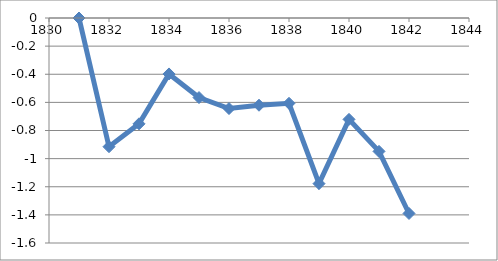
| Category | Series 0 |
|---|---|
| 1831.0 | 0 |
| 1832.0 | -0.915 |
| 1833.0 | -0.753 |
| 1834.0 | -0.398 |
| 1835.0 | -0.566 |
| 1836.0 | -0.644 |
| 1837.0 | -0.62 |
| 1838.0 | -0.606 |
| 1839.0 | -1.178 |
| 1840.0 | -0.721 |
| 1841.0 | -0.949 |
| 1842.0 | -1.39 |